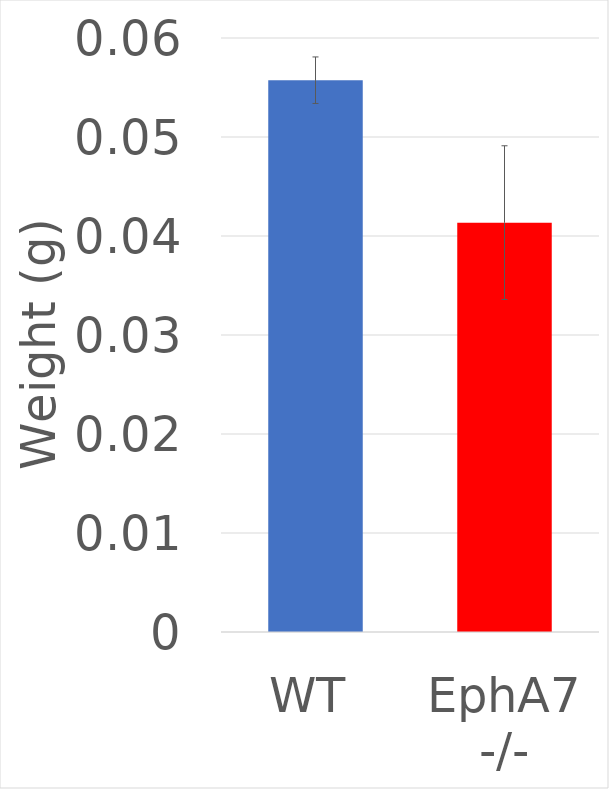
| Category | Series 0 |
|---|---|
| WT | 0.056 |
| EphA7 -/- | 0.041 |